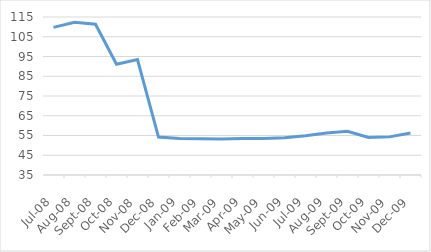
| Category | Series 0 |
|---|---|
| 2008-07-01 | 109.73 |
| 2008-08-01 | 112.289 |
| 2008-09-01 | 111.364 |
| 2008-10-01 | 91.085 |
| 2008-11-01 | 93.446 |
| 2008-12-01 | 54.227 |
| 2009-01-01 | 53.478 |
| 2009-02-01 | 53.333 |
| 2009-03-01 | 53.196 |
| 2009-04-01 | 53.499 |
| 2009-05-01 | 53.439 |
| 2009-06-01 | 53.891 |
| 2009-07-01 | 54.846 |
| 2009-08-01 | 56.31 |
| 2009-09-01 | 57.138 |
| 2009-10-01 | 53.984 |
| 2009-11-01 | 54.303 |
| 2009-12-01 | 56.262 |